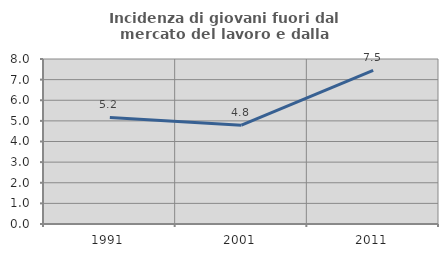
| Category | Incidenza di giovani fuori dal mercato del lavoro e dalla formazione  |
|---|---|
| 1991.0 | 5.164 |
| 2001.0 | 4.79 |
| 2011.0 | 7.453 |